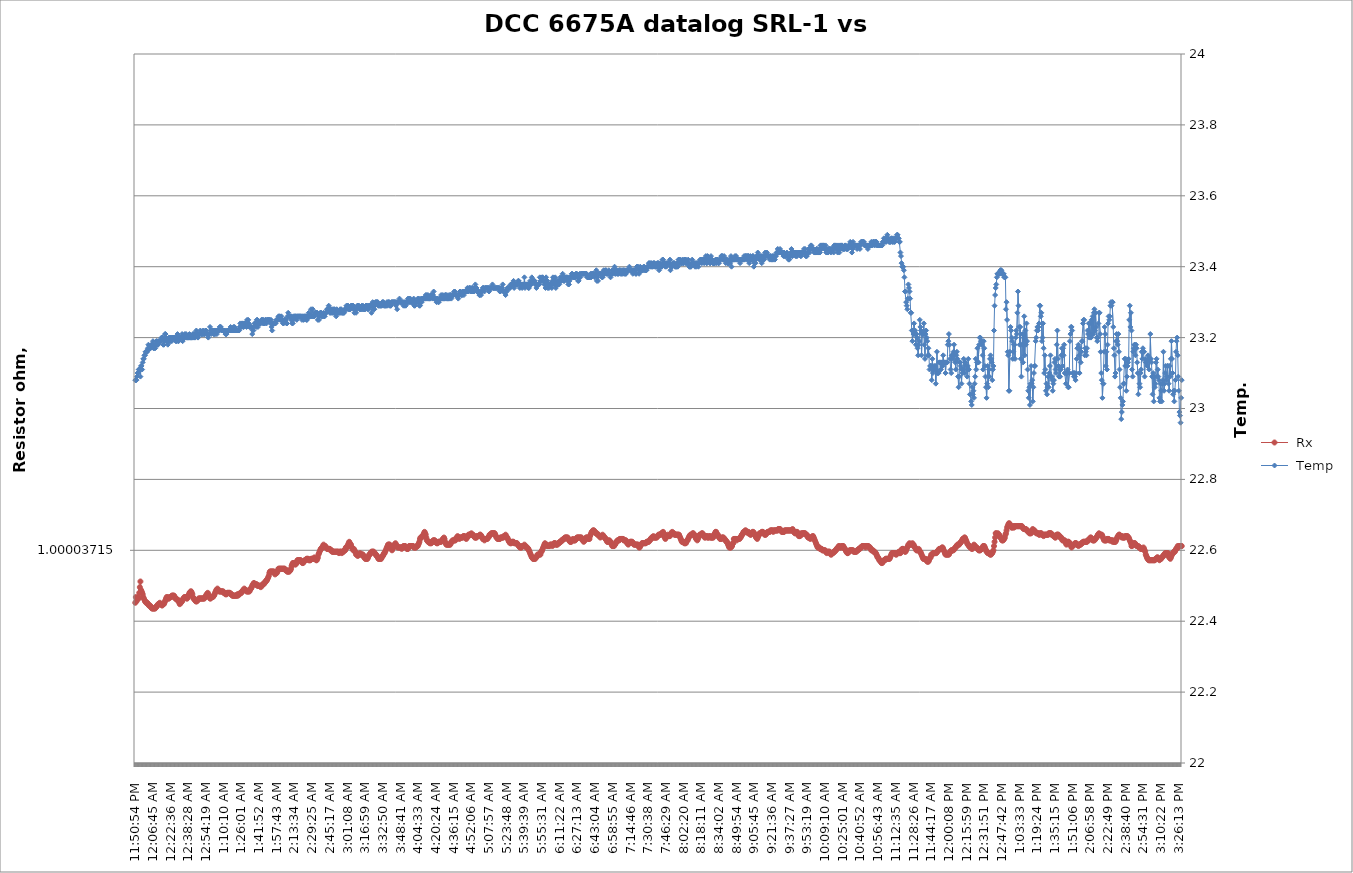
| Category |  Rx |
|---|---|
| 2021-03-05 23:50:54 | 1 |
| 2021-03-05 23:51:25 | 1 |
| 2021-03-05 23:51:55 | 1 |
| 2021-03-05 23:52:26 | 1 |
| 2021-03-05 23:52:57 | 1 |
| 2021-03-05 23:53:28 | 1 |
| 2021-03-05 23:53:58 | 1 |
| 2021-03-05 23:54:29 | 1 |
| 2021-03-05 23:55:00 | 1 |
| 2021-03-05 23:55:30 | 1 |
| 2021-03-05 23:56:01 | 1 |
| 2021-03-05 23:56:32 | 1 |
| 2021-03-05 23:57:02 | 1 |
| 2021-03-05 23:57:33 | 1 |
| 2021-03-05 23:58:04 | 1 |
| 2021-03-05 23:58:34 | 1 |
| 2021-03-05 23:59:05 | 1 |
| 2021-03-05 23:59:36 | 1 |
| 2021-03-06 00:00:06 | 1 |
| 2021-03-06 00:00:37 | 1 |
| 2021-03-06 00:01:08 | 1 |
| 2021-03-06 00:01:38 | 1 |
| 2021-03-06 00:02:09 | 1 |
| 2021-03-06 00:02:40 | 1 |
| 2021-03-06 00:03:10 | 1 |
| 2021-03-06 00:03:41 | 1 |
| 2021-03-06 00:04:12 | 1 |
| 2021-03-06 00:04:43 | 1 |
| 2021-03-06 00:05:13 | 1 |
| 2021-03-06 00:05:44 | 1 |
| 2021-03-06 00:06:15 | 1 |
| 2021-03-06 00:06:45 | 1 |
| 2021-03-06 00:07:16 | 1 |
| 2021-03-06 00:07:47 | 1 |
| 2021-03-06 00:08:17 | 1 |
| 2021-03-06 00:08:48 | 1 |
| 2021-03-06 00:09:19 | 1 |
| 2021-03-06 00:09:49 | 1 |
| 2021-03-06 00:10:20 | 1 |
| 2021-03-06 00:10:51 | 1 |
| 2021-03-06 00:11:21 | 1 |
| 2021-03-06 00:11:52 | 1 |
| 2021-03-06 00:12:23 | 1 |
| 2021-03-06 00:12:53 | 1 |
| 2021-03-06 00:13:24 | 1 |
| 2021-03-06 00:13:55 | 1 |
| 2021-03-06 00:14:25 | 1 |
| 2021-03-06 00:14:56 | 1 |
| 2021-03-06 00:15:27 | 1 |
| 2021-03-06 00:15:58 | 1 |
| 2021-03-06 00:16:28 | 1 |
| 2021-03-06 00:16:59 | 1 |
| 2021-03-06 00:17:30 | 1 |
| 2021-03-06 00:18:00 | 1 |
| 2021-03-06 00:18:31 | 1 |
| 2021-03-06 00:19:02 | 1 |
| 2021-03-06 00:19:32 | 1 |
| 2021-03-06 00:20:03 | 1 |
| 2021-03-06 00:20:34 | 1 |
| 2021-03-06 00:21:04 | 1 |
| 2021-03-06 00:21:35 | 1 |
| 2021-03-06 00:22:06 | 1 |
| 2021-03-06 00:22:36 | 1 |
| 2021-03-06 00:23:07 | 1 |
| 2021-03-06 00:23:38 | 1 |
| 2021-03-06 00:24:08 | 1 |
| 2021-03-06 00:24:39 | 1 |
| 2021-03-06 00:25:10 | 1 |
| 2021-03-06 00:25:40 | 1 |
| 2021-03-06 00:26:11 | 1 |
| 2021-03-06 00:26:42 | 1 |
| 2021-03-06 00:27:12 | 1 |
| 2021-03-06 00:27:43 | 1 |
| 2021-03-06 00:28:14 | 1 |
| 2021-03-06 00:28:45 | 1 |
| 2021-03-06 00:29:15 | 1 |
| 2021-03-06 00:29:46 | 1 |
| 2021-03-06 00:30:17 | 1 |
| 2021-03-06 00:30:47 | 1 |
| 2021-03-06 00:31:18 | 1 |
| 2021-03-06 00:31:49 | 1 |
| 2021-03-06 00:32:19 | 1 |
| 2021-03-06 00:32:50 | 1 |
| 2021-03-06 00:33:21 | 1 |
| 2021-03-06 00:33:51 | 1 |
| 2021-03-06 00:34:22 | 1 |
| 2021-03-06 00:34:53 | 1 |
| 2021-03-06 00:35:23 | 1 |
| 2021-03-06 00:35:54 | 1 |
| 2021-03-06 00:36:25 | 1 |
| 2021-03-06 00:36:55 | 1 |
| 2021-03-06 00:37:26 | 1 |
| 2021-03-06 00:37:57 | 1 |
| 2021-03-06 00:38:28 | 1 |
| 2021-03-06 00:38:58 | 1 |
| 2021-03-06 00:39:29 | 1 |
| 2021-03-06 00:40:00 | 1 |
| 2021-03-06 00:40:30 | 1 |
| 2021-03-06 00:41:01 | 1 |
| 2021-03-06 00:41:32 | 1 |
| 2021-03-06 00:42:02 | 1 |
| 2021-03-06 00:42:33 | 1 |
| 2021-03-06 00:43:04 | 1 |
| 2021-03-06 00:43:34 | 1 |
| 2021-03-06 00:44:05 | 1 |
| 2021-03-06 00:44:36 | 1 |
| 2021-03-06 00:45:06 | 1 |
| 2021-03-06 00:45:37 | 1 |
| 2021-03-06 00:46:08 | 1 |
| 2021-03-06 00:46:38 | 1 |
| 2021-03-06 00:47:09 | 1 |
| 2021-03-06 00:47:40 | 1 |
| 2021-03-06 00:48:10 | 1 |
| 2021-03-06 00:48:41 | 1 |
| 2021-03-06 00:49:12 | 1 |
| 2021-03-06 00:49:42 | 1 |
| 2021-03-06 00:50:13 | 1 |
| 2021-03-06 00:50:44 | 1 |
| 2021-03-06 00:51:15 | 1 |
| 2021-03-06 00:51:45 | 1 |
| 2021-03-06 00:52:16 | 1 |
| 2021-03-06 00:52:47 | 1 |
| 2021-03-06 00:53:17 | 1 |
| 2021-03-06 00:53:48 | 1 |
| 2021-03-06 00:54:19 | 1 |
| 2021-03-06 00:54:49 | 1 |
| 2021-03-06 00:55:20 | 1 |
| 2021-03-06 00:55:51 | 1 |
| 2021-03-06 00:56:21 | 1 |
| 2021-03-06 00:56:52 | 1 |
| 2021-03-06 00:57:23 | 1 |
| 2021-03-06 00:57:53 | 1 |
| 2021-03-06 00:58:24 | 1 |
| 2021-03-06 00:58:55 | 1 |
| 2021-03-06 00:59:25 | 1 |
| 2021-03-06 00:59:56 | 1 |
| 2021-03-06 01:00:27 | 1 |
| 2021-03-06 01:00:57 | 1 |
| 2021-03-06 01:01:28 | 1 |
| 2021-03-06 01:01:59 | 1 |
| 2021-03-06 01:02:30 | 1 |
| 2021-03-06 01:03:00 | 1 |
| 2021-03-06 01:03:31 | 1 |
| 2021-03-06 01:04:02 | 1 |
| 2021-03-06 01:04:32 | 1 |
| 2021-03-06 01:05:03 | 1 |
| 2021-03-06 01:05:34 | 1 |
| 2021-03-06 01:06:04 | 1 |
| 2021-03-06 01:06:35 | 1 |
| 2021-03-06 01:07:06 | 1 |
| 2021-03-06 01:07:36 | 1 |
| 2021-03-06 01:08:07 | 1 |
| 2021-03-06 01:08:38 | 1 |
| 2021-03-06 01:09:08 | 1 |
| 2021-03-06 01:09:39 | 1 |
| 2021-03-06 01:10:10 | 1 |
| 2021-03-06 01:10:40 | 1 |
| 2021-03-06 01:11:11 | 1 |
| 2021-03-06 01:11:42 | 1 |
| 2021-03-06 01:12:12 | 1 |
| 2021-03-06 01:12:43 | 1 |
| 2021-03-06 01:13:14 | 1 |
| 2021-03-06 01:13:44 | 1 |
| 2021-03-06 01:14:15 | 1 |
| 2021-03-06 01:14:46 | 1 |
| 2021-03-06 01:15:17 | 1 |
| 2021-03-06 01:15:47 | 1 |
| 2021-03-06 01:16:18 | 1 |
| 2021-03-06 01:16:49 | 1 |
| 2021-03-06 01:17:19 | 1 |
| 2021-03-06 01:17:50 | 1 |
| 2021-03-06 01:18:21 | 1 |
| 2021-03-06 01:18:51 | 1 |
| 2021-03-06 01:19:22 | 1 |
| 2021-03-06 01:19:53 | 1 |
| 2021-03-06 01:20:23 | 1 |
| 2021-03-06 01:20:54 | 1 |
| 2021-03-06 01:21:25 | 1 |
| 2021-03-06 01:21:55 | 1 |
| 2021-03-06 01:22:26 | 1 |
| 2021-03-06 01:22:57 | 1 |
| 2021-03-06 01:23:27 | 1 |
| 2021-03-06 01:23:58 | 1 |
| 2021-03-06 01:24:29 | 1 |
| 2021-03-06 01:24:59 | 1 |
| 2021-03-06 01:25:30 | 1 |
| 2021-03-06 01:26:01 | 1 |
| 2021-03-06 01:26:31 | 1 |
| 2021-03-06 01:27:02 | 1 |
| 2021-03-06 01:27:33 | 1 |
| 2021-03-06 01:28:04 | 1 |
| 2021-03-06 01:28:34 | 1 |
| 2021-03-06 01:29:05 | 1 |
| 2021-03-06 01:29:36 | 1 |
| 2021-03-06 01:30:06 | 1 |
| 2021-03-06 01:30:37 | 1 |
| 2021-03-06 01:31:08 | 1 |
| 2021-03-06 01:31:38 | 1 |
| 2021-03-06 01:32:09 | 1 |
| 2021-03-06 01:32:40 | 1 |
| 2021-03-06 01:33:10 | 1 |
| 2021-03-06 01:33:41 | 1 |
| 2021-03-06 01:34:12 | 1 |
| 2021-03-06 01:34:42 | 1 |
| 2021-03-06 01:35:13 | 1 |
| 2021-03-06 01:35:44 | 1 |
| 2021-03-06 01:36:14 | 1 |
| 2021-03-06 01:36:45 | 1 |
| 2021-03-06 01:37:16 | 1 |
| 2021-03-06 01:37:46 | 1 |
| 2021-03-06 01:38:17 | 1 |
| 2021-03-06 01:38:48 | 1 |
| 2021-03-06 01:39:19 | 1 |
| 2021-03-06 01:39:49 | 1 |
| 2021-03-06 01:40:20 | 1 |
| 2021-03-06 01:40:51 | 1 |
| 2021-03-06 01:41:21 | 1 |
| 2021-03-06 01:41:52 | 1 |
| 2021-03-06 01:42:23 | 1 |
| 2021-03-06 01:42:53 | 1 |
| 2021-03-06 01:43:24 | 1 |
| 2021-03-06 01:43:55 | 1 |
| 2021-03-06 01:44:25 | 1 |
| 2021-03-06 01:44:56 | 1 |
| 2021-03-06 01:45:27 | 1 |
| 2021-03-06 01:45:57 | 1 |
| 2021-03-06 01:46:28 | 1 |
| 2021-03-06 01:46:59 | 1 |
| 2021-03-06 01:47:29 | 1 |
| 2021-03-06 01:48:00 | 1 |
| 2021-03-06 01:48:31 | 1 |
| 2021-03-06 01:49:01 | 1 |
| 2021-03-06 01:49:32 | 1 |
| 2021-03-06 01:50:03 | 1 |
| 2021-03-06 01:50:34 | 1 |
| 2021-03-06 01:51:04 | 1 |
| 2021-03-06 01:51:35 | 1 |
| 2021-03-06 01:52:06 | 1 |
| 2021-03-06 01:52:36 | 1 |
| 2021-03-06 01:53:07 | 1 |
| 2021-03-06 01:53:38 | 1 |
| 2021-03-06 01:54:08 | 1 |
| 2021-03-06 01:54:39 | 1 |
| 2021-03-06 01:55:10 | 1 |
| 2021-03-06 01:55:40 | 1 |
| 2021-03-06 01:56:11 | 1 |
| 2021-03-06 01:56:42 | 1 |
| 2021-03-06 01:57:12 | 1 |
| 2021-03-06 01:57:43 | 1 |
| 2021-03-06 01:58:14 | 1 |
| 2021-03-06 01:58:44 | 1 |
| 2021-03-06 01:59:15 | 1 |
| 2021-03-06 01:59:46 | 1 |
| 2021-03-06 02:00:17 | 1 |
| 2021-03-06 02:00:47 | 1 |
| 2021-03-06 02:01:18 | 1 |
| 2021-03-06 02:01:49 | 1 |
| 2021-03-06 02:02:19 | 1 |
| 2021-03-06 02:02:50 | 1 |
| 2021-03-06 02:03:21 | 1 |
| 2021-03-06 02:03:51 | 1 |
| 2021-03-06 02:04:22 | 1 |
| 2021-03-06 02:04:53 | 1 |
| 2021-03-06 02:05:23 | 1 |
| 2021-03-06 02:05:54 | 1 |
| 2021-03-06 02:06:25 | 1 |
| 2021-03-06 02:06:55 | 1 |
| 2021-03-06 02:07:26 | 1 |
| 2021-03-06 02:07:57 | 1 |
| 2021-03-06 02:08:27 | 1 |
| 2021-03-06 02:08:58 | 1 |
| 2021-03-06 02:09:29 | 1 |
| 2021-03-06 02:10:00 | 1 |
| 2021-03-06 02:10:30 | 1 |
| 2021-03-06 02:11:01 | 1 |
| 2021-03-06 02:11:32 | 1 |
| 2021-03-06 02:12:02 | 1 |
| 2021-03-06 02:12:33 | 1 |
| 2021-03-06 02:13:04 | 1 |
| 2021-03-06 02:13:34 | 1 |
| 2021-03-06 02:14:05 | 1 |
| 2021-03-06 02:14:36 | 1 |
| 2021-03-06 02:15:06 | 1 |
| 2021-03-06 02:15:37 | 1 |
| 2021-03-06 02:16:08 | 1 |
| 2021-03-06 02:16:38 | 1 |
| 2021-03-06 02:17:09 | 1 |
| 2021-03-06 02:17:40 | 1 |
| 2021-03-06 02:18:10 | 1 |
| 2021-03-06 02:18:41 | 1 |
| 2021-03-06 02:19:12 | 1 |
| 2021-03-06 02:19:42 | 1 |
| 2021-03-06 02:20:13 | 1 |
| 2021-03-06 02:20:44 | 1 |
| 2021-03-06 02:21:15 | 1 |
| 2021-03-06 02:21:45 | 1 |
| 2021-03-06 02:22:16 | 1 |
| 2021-03-06 02:22:47 | 1 |
| 2021-03-06 02:23:17 | 1 |
| 2021-03-06 02:23:48 | 1 |
| 2021-03-06 02:24:19 | 1 |
| 2021-03-06 02:24:49 | 1 |
| 2021-03-06 02:25:20 | 1 |
| 2021-03-06 02:25:51 | 1 |
| 2021-03-06 02:26:21 | 1 |
| 2021-03-06 02:26:52 | 1 |
| 2021-03-06 02:27:23 | 1 |
| 2021-03-06 02:27:53 | 1 |
| 2021-03-06 02:28:24 | 1 |
| 2021-03-06 02:28:55 | 1 |
| 2021-03-06 02:29:25 | 1 |
| 2021-03-06 02:29:56 | 1 |
| 2021-03-06 02:30:27 | 1 |
| 2021-03-06 02:30:58 | 1 |
| 2021-03-06 02:31:28 | 1 |
| 2021-03-06 02:31:59 | 1 |
| 2021-03-06 02:32:30 | 1 |
| 2021-03-06 02:33:00 | 1 |
| 2021-03-06 02:33:31 | 1 |
| 2021-03-06 02:34:02 | 1 |
| 2021-03-06 02:34:32 | 1 |
| 2021-03-06 02:35:03 | 1 |
| 2021-03-06 02:35:34 | 1 |
| 2021-03-06 02:36:04 | 1 |
| 2021-03-06 02:36:35 | 1 |
| 2021-03-06 02:37:06 | 1 |
| 2021-03-06 02:37:36 | 1 |
| 2021-03-06 02:38:07 | 1 |
| 2021-03-06 02:38:38 | 1 |
| 2021-03-06 02:39:08 | 1 |
| 2021-03-06 02:39:39 | 1 |
| 2021-03-06 02:40:10 | 1 |
| 2021-03-06 02:40:41 | 1 |
| 2021-03-06 02:41:11 | 1 |
| 2021-03-06 02:41:42 | 1 |
| 2021-03-06 02:42:13 | 1 |
| 2021-03-06 02:42:43 | 1 |
| 2021-03-06 02:43:14 | 1 |
| 2021-03-06 02:43:45 | 1 |
| 2021-03-06 02:44:15 | 1 |
| 2021-03-06 02:44:46 | 1 |
| 2021-03-06 02:45:17 | 1 |
| 2021-03-06 02:45:47 | 1 |
| 2021-03-06 02:46:18 | 1 |
| 2021-03-06 02:46:49 | 1 |
| 2021-03-06 02:47:19 | 1 |
| 2021-03-06 02:47:50 | 1 |
| 2021-03-06 02:48:21 | 1 |
| 2021-03-06 02:48:51 | 1 |
| 2021-03-06 02:49:22 | 1 |
| 2021-03-06 02:49:53 | 1 |
| 2021-03-06 02:50:24 | 1 |
| 2021-03-06 02:50:54 | 1 |
| 2021-03-06 02:51:25 | 1 |
| 2021-03-06 02:51:56 | 1 |
| 2021-03-06 02:52:26 | 1 |
| 2021-03-06 02:52:57 | 1 |
| 2021-03-06 02:53:28 | 1 |
| 2021-03-06 02:53:58 | 1 |
| 2021-03-06 02:54:29 | 1 |
| 2021-03-06 02:55:00 | 1 |
| 2021-03-06 02:55:30 | 1 |
| 2021-03-06 02:56:01 | 1 |
| 2021-03-06 02:56:32 | 1 |
| 2021-03-06 02:57:02 | 1 |
| 2021-03-06 02:57:33 | 1 |
| 2021-03-06 02:58:04 | 1 |
| 2021-03-06 02:58:35 | 1 |
| 2021-03-06 02:59:05 | 1 |
| 2021-03-06 02:59:36 | 1 |
| 2021-03-06 03:00:07 | 1 |
| 2021-03-06 03:00:37 | 1 |
| 2021-03-06 03:01:08 | 1 |
| 2021-03-06 03:01:39 | 1 |
| 2021-03-06 03:02:09 | 1 |
| 2021-03-06 03:02:40 | 1 |
| 2021-03-06 03:03:11 | 1 |
| 2021-03-06 03:03:41 | 1 |
| 2021-03-06 03:04:12 | 1 |
| 2021-03-06 03:04:43 | 1 |
| 2021-03-06 03:05:13 | 1 |
| 2021-03-06 03:05:44 | 1 |
| 2021-03-06 03:06:15 | 1 |
| 2021-03-06 03:06:45 | 1 |
| 2021-03-06 03:07:16 | 1 |
| 2021-03-06 03:07:47 | 1 |
| 2021-03-06 03:08:18 | 1 |
| 2021-03-06 03:08:48 | 1 |
| 2021-03-06 03:09:19 | 1 |
| 2021-03-06 03:09:50 | 1 |
| 2021-03-06 03:10:20 | 1 |
| 2021-03-06 03:10:51 | 1 |
| 2021-03-06 03:11:22 | 1 |
| 2021-03-06 03:11:52 | 1 |
| 2021-03-06 03:12:23 | 1 |
| 2021-03-06 03:12:54 | 1 |
| 2021-03-06 03:13:24 | 1 |
| 2021-03-06 03:13:55 | 1 |
| 2021-03-06 03:14:26 | 1 |
| 2021-03-06 03:14:56 | 1 |
| 2021-03-06 03:15:27 | 1 |
| 2021-03-06 03:15:58 | 1 |
| 2021-03-06 03:16:28 | 1 |
| 2021-03-06 03:16:59 | 1 |
| 2021-03-06 03:17:30 | 1 |
| 2021-03-06 03:18:01 | 1 |
| 2021-03-06 03:18:31 | 1 |
| 2021-03-06 03:19:02 | 1 |
| 2021-03-06 03:19:33 | 1 |
| 2021-03-06 03:20:03 | 1 |
| 2021-03-06 03:20:34 | 1 |
| 2021-03-06 03:21:05 | 1 |
| 2021-03-06 03:21:35 | 1 |
| 2021-03-06 03:22:06 | 1 |
| 2021-03-06 03:22:37 | 1 |
| 2021-03-06 03:23:07 | 1 |
| 2021-03-06 03:23:38 | 1 |
| 2021-03-06 03:24:09 | 1 |
| 2021-03-06 03:24:39 | 1 |
| 2021-03-06 03:25:10 | 1 |
| 2021-03-06 03:25:41 | 1 |
| 2021-03-06 03:26:11 | 1 |
| 2021-03-06 03:26:42 | 1 |
| 2021-03-06 03:27:13 | 1 |
| 2021-03-06 03:27:44 | 1 |
| 2021-03-06 03:28:14 | 1 |
| 2021-03-06 03:28:45 | 1 |
| 2021-03-06 03:29:16 | 1 |
| 2021-03-06 03:29:46 | 1 |
| 2021-03-06 03:30:17 | 1 |
| 2021-03-06 03:30:48 | 1 |
| 2021-03-06 03:31:18 | 1 |
| 2021-03-06 03:31:49 | 1 |
| 2021-03-06 03:32:20 | 1 |
| 2021-03-06 03:32:50 | 1 |
| 2021-03-06 03:33:21 | 1 |
| 2021-03-06 03:33:52 | 1 |
| 2021-03-06 03:34:22 | 1 |
| 2021-03-06 03:34:53 | 1 |
| 2021-03-06 03:35:24 | 1 |
| 2021-03-06 03:35:54 | 1 |
| 2021-03-06 03:36:25 | 1 |
| 2021-03-06 03:36:56 | 1 |
| 2021-03-06 03:37:26 | 1 |
| 2021-03-06 03:37:57 | 1 |
| 2021-03-06 03:38:28 | 1 |
| 2021-03-06 03:38:59 | 1 |
| 2021-03-06 03:39:29 | 1 |
| 2021-03-06 03:40:00 | 1 |
| 2021-03-06 03:40:31 | 1 |
| 2021-03-06 03:41:01 | 1 |
| 2021-03-06 03:41:32 | 1 |
| 2021-03-06 03:42:03 | 1 |
| 2021-03-06 03:42:33 | 1 |
| 2021-03-06 03:43:04 | 1 |
| 2021-03-06 03:43:35 | 1 |
| 2021-03-06 03:44:05 | 1 |
| 2021-03-06 03:44:36 | 1 |
| 2021-03-06 03:45:07 | 1 |
| 2021-03-06 03:45:37 | 1 |
| 2021-03-06 03:46:08 | 1 |
| 2021-03-06 03:46:39 | 1 |
| 2021-03-06 03:47:09 | 1 |
| 2021-03-06 03:47:40 | 1 |
| 2021-03-06 03:48:11 | 1 |
| 2021-03-06 03:48:41 | 1 |
| 2021-03-06 03:49:12 | 1 |
| 2021-03-06 03:49:43 | 1 |
| 2021-03-06 03:50:14 | 1 |
| 2021-03-06 03:50:44 | 1 |
| 2021-03-06 03:51:15 | 1 |
| 2021-03-06 03:51:46 | 1 |
| 2021-03-06 03:52:16 | 1 |
| 2021-03-06 03:52:47 | 1 |
| 2021-03-06 03:53:18 | 1 |
| 2021-03-06 03:53:48 | 1 |
| 2021-03-06 03:54:19 | 1 |
| 2021-03-06 03:54:50 | 1 |
| 2021-03-06 03:55:20 | 1 |
| 2021-03-06 03:55:51 | 1 |
| 2021-03-06 03:56:22 | 1 |
| 2021-03-06 03:56:52 | 1 |
| 2021-03-06 03:57:23 | 1 |
| 2021-03-06 03:57:54 | 1 |
| 2021-03-06 03:58:24 | 1 |
| 2021-03-06 03:58:55 | 1 |
| 2021-03-06 03:59:26 | 1 |
| 2021-03-06 03:59:56 | 1 |
| 2021-03-06 04:00:27 | 1 |
| 2021-03-06 04:00:58 | 1 |
| 2021-03-06 04:01:29 | 1 |
| 2021-03-06 04:01:59 | 1 |
| 2021-03-06 04:02:30 | 1 |
| 2021-03-06 04:03:01 | 1 |
| 2021-03-06 04:03:31 | 1 |
| 2021-03-06 04:04:02 | 1 |
| 2021-03-06 04:04:33 | 1 |
| 2021-03-06 04:05:03 | 1 |
| 2021-03-06 04:05:34 | 1 |
| 2021-03-06 04:06:05 | 1 |
| 2021-03-06 04:06:35 | 1 |
| 2021-03-06 04:07:06 | 1 |
| 2021-03-06 04:07:37 | 1 |
| 2021-03-06 04:08:07 | 1 |
| 2021-03-06 04:08:38 | 1 |
| 2021-03-06 04:09:09 | 1 |
| 2021-03-06 04:09:39 | 1 |
| 2021-03-06 04:10:10 | 1 |
| 2021-03-06 04:10:41 | 1 |
| 2021-03-06 04:11:12 | 1 |
| 2021-03-06 04:11:42 | 1 |
| 2021-03-06 04:12:13 | 1 |
| 2021-03-06 04:12:44 | 1 |
| 2021-03-06 04:13:14 | 1 |
| 2021-03-06 04:13:45 | 1 |
| 2021-03-06 04:14:16 | 1 |
| 2021-03-06 04:14:46 | 1 |
| 2021-03-06 04:15:17 | 1 |
| 2021-03-06 04:15:48 | 1 |
| 2021-03-06 04:16:18 | 1 |
| 2021-03-06 04:16:49 | 1 |
| 2021-03-06 04:17:20 | 1 |
| 2021-03-06 04:17:50 | 1 |
| 2021-03-06 04:18:21 | 1 |
| 2021-03-06 04:18:52 | 1 |
| 2021-03-06 04:19:22 | 1 |
| 2021-03-06 04:19:53 | 1 |
| 2021-03-06 04:20:24 | 1 |
| 2021-03-06 04:20:54 | 1 |
| 2021-03-06 04:21:25 | 1 |
| 2021-03-06 04:21:56 | 1 |
| 2021-03-06 04:22:27 | 1 |
| 2021-03-06 04:22:57 | 1 |
| 2021-03-06 04:23:28 | 1 |
| 2021-03-06 04:23:59 | 1 |
| 2021-03-06 04:24:29 | 1 |
| 2021-03-06 04:25:00 | 1 |
| 2021-03-06 04:25:31 | 1 |
| 2021-03-06 04:26:01 | 1 |
| 2021-03-06 04:26:32 | 1 |
| 2021-03-06 04:27:03 | 1 |
| 2021-03-06 04:27:33 | 1 |
| 2021-03-06 04:28:04 | 1 |
| 2021-03-06 04:28:35 | 1 |
| 2021-03-06 04:29:05 | 1 |
| 2021-03-06 04:29:36 | 1 |
| 2021-03-06 04:30:07 | 1 |
| 2021-03-06 04:30:37 | 1 |
| 2021-03-06 04:31:08 | 1 |
| 2021-03-06 04:31:39 | 1 |
| 2021-03-06 04:32:09 | 1 |
| 2021-03-06 04:32:40 | 1 |
| 2021-03-06 04:33:11 | 1 |
| 2021-03-06 04:33:42 | 1 |
| 2021-03-06 04:34:12 | 1 |
| 2021-03-06 04:34:43 | 1 |
| 2021-03-06 04:35:14 | 1 |
| 2021-03-06 04:35:44 | 1 |
| 2021-03-06 04:36:15 | 1 |
| 2021-03-06 04:36:46 | 1 |
| 2021-03-06 04:37:16 | 1 |
| 2021-03-06 04:37:47 | 1 |
| 2021-03-06 04:38:18 | 1 |
| 2021-03-06 04:38:48 | 1 |
| 2021-03-06 04:39:19 | 1 |
| 2021-03-06 04:39:50 | 1 |
| 2021-03-06 04:40:20 | 1 |
| 2021-03-06 04:40:51 | 1 |
| 2021-03-06 04:41:22 | 1 |
| 2021-03-06 04:41:52 | 1 |
| 2021-03-06 04:42:23 | 1 |
| 2021-03-06 04:42:54 | 1 |
| 2021-03-06 04:43:24 | 1 |
| 2021-03-06 04:43:55 | 1 |
| 2021-03-06 04:44:26 | 1 |
| 2021-03-06 04:44:57 | 1 |
| 2021-03-06 04:45:27 | 1 |
| 2021-03-06 04:45:58 | 1 |
| 2021-03-06 04:46:29 | 1 |
| 2021-03-06 04:46:59 | 1 |
| 2021-03-06 04:47:30 | 1 |
| 2021-03-06 04:48:01 | 1 |
| 2021-03-06 04:48:31 | 1 |
| 2021-03-06 04:49:02 | 1 |
| 2021-03-06 04:49:33 | 1 |
| 2021-03-06 04:50:03 | 1 |
| 2021-03-06 04:50:34 | 1 |
| 2021-03-06 04:51:05 | 1 |
| 2021-03-06 04:51:35 | 1 |
| 2021-03-06 04:52:06 | 1 |
| 2021-03-06 04:52:37 | 1 |
| 2021-03-06 04:53:07 | 1 |
| 2021-03-06 04:53:38 | 1 |
| 2021-03-06 04:54:09 | 1 |
| 2021-03-06 04:54:39 | 1 |
| 2021-03-06 04:55:10 | 1 |
| 2021-03-06 04:55:41 | 1 |
| 2021-03-06 04:56:12 | 1 |
| 2021-03-06 04:56:42 | 1 |
| 2021-03-06 04:57:13 | 1 |
| 2021-03-06 04:57:44 | 1 |
| 2021-03-06 04:58:14 | 1 |
| 2021-03-06 04:58:45 | 1 |
| 2021-03-06 04:59:16 | 1 |
| 2021-03-06 04:59:46 | 1 |
| 2021-03-06 05:00:17 | 1 |
| 2021-03-06 05:00:48 | 1 |
| 2021-03-06 05:01:18 | 1 |
| 2021-03-06 05:01:49 | 1 |
| 2021-03-06 05:02:20 | 1 |
| 2021-03-06 05:02:50 | 1 |
| 2021-03-06 05:03:21 | 1 |
| 2021-03-06 05:03:52 | 1 |
| 2021-03-06 05:04:22 | 1 |
| 2021-03-06 05:04:53 | 1 |
| 2021-03-06 05:05:24 | 1 |
| 2021-03-06 05:05:54 | 1 |
| 2021-03-06 05:06:25 | 1 |
| 2021-03-06 05:06:56 | 1 |
| 2021-03-06 05:07:27 | 1 |
| 2021-03-06 05:07:57 | 1 |
| 2021-03-06 05:08:28 | 1 |
| 2021-03-06 05:08:59 | 1 |
| 2021-03-06 05:09:29 | 1 |
| 2021-03-06 05:10:00 | 1 |
| 2021-03-06 05:10:31 | 1 |
| 2021-03-06 05:11:01 | 1 |
| 2021-03-06 05:11:32 | 1 |
| 2021-03-06 05:12:03 | 1 |
| 2021-03-06 05:12:33 | 1 |
| 2021-03-06 05:13:04 | 1 |
| 2021-03-06 05:13:35 | 1 |
| 2021-03-06 05:14:05 | 1 |
| 2021-03-06 05:14:36 | 1 |
| 2021-03-06 05:15:07 | 1 |
| 2021-03-06 05:15:37 | 1 |
| 2021-03-06 05:16:08 | 1 |
| 2021-03-06 05:16:39 | 1 |
| 2021-03-06 05:17:09 | 1 |
| 2021-03-06 05:17:40 | 1 |
| 2021-03-06 05:18:11 | 1 |
| 2021-03-06 05:18:42 | 1 |
| 2021-03-06 05:19:12 | 1 |
| 2021-03-06 05:19:43 | 1 |
| 2021-03-06 05:20:14 | 1 |
| 2021-03-06 05:20:44 | 1 |
| 2021-03-06 05:21:15 | 1 |
| 2021-03-06 05:21:46 | 1 |
| 2021-03-06 05:22:16 | 1 |
| 2021-03-06 05:22:47 | 1 |
| 2021-03-06 05:23:18 | 1 |
| 2021-03-06 05:23:48 | 1 |
| 2021-03-06 05:24:19 | 1 |
| 2021-03-06 05:24:50 | 1 |
| 2021-03-06 05:25:20 | 1 |
| 2021-03-06 05:25:51 | 1 |
| 2021-03-06 05:26:22 | 1 |
| 2021-03-06 05:26:52 | 1 |
| 2021-03-06 05:27:23 | 1 |
| 2021-03-06 05:27:54 | 1 |
| 2021-03-06 05:28:24 | 1 |
| 2021-03-06 05:28:55 | 1 |
| 2021-03-06 05:29:26 | 1 |
| 2021-03-06 05:29:57 | 1 |
| 2021-03-06 05:30:27 | 1 |
| 2021-03-06 05:30:58 | 1 |
| 2021-03-06 05:31:29 | 1 |
| 2021-03-06 05:31:59 | 1 |
| 2021-03-06 05:32:30 | 1 |
| 2021-03-06 05:33:01 | 1 |
| 2021-03-06 05:33:31 | 1 |
| 2021-03-06 05:34:02 | 1 |
| 2021-03-06 05:34:33 | 1 |
| 2021-03-06 05:35:03 | 1 |
| 2021-03-06 05:35:34 | 1 |
| 2021-03-06 05:36:05 | 1 |
| 2021-03-06 05:36:35 | 1 |
| 2021-03-06 05:37:06 | 1 |
| 2021-03-06 05:37:37 | 1 |
| 2021-03-06 05:38:07 | 1 |
| 2021-03-06 05:38:38 | 1 |
| 2021-03-06 05:39:09 | 1 |
| 2021-03-06 05:39:39 | 1 |
| 2021-03-06 05:40:10 | 1 |
| 2021-03-06 05:40:41 | 1 |
| 2021-03-06 05:41:12 | 1 |
| 2021-03-06 05:41:42 | 1 |
| 2021-03-06 05:42:13 | 1 |
| 2021-03-06 05:42:44 | 1 |
| 2021-03-06 05:43:14 | 1 |
| 2021-03-06 05:43:45 | 1 |
| 2021-03-06 05:44:16 | 1 |
| 2021-03-06 05:44:46 | 1 |
| 2021-03-06 05:45:17 | 1 |
| 2021-03-06 05:45:48 | 1 |
| 2021-03-06 05:46:18 | 1 |
| 2021-03-06 05:46:49 | 1 |
| 2021-03-06 05:47:20 | 1 |
| 2021-03-06 05:47:50 | 1 |
| 2021-03-06 05:48:21 | 1 |
| 2021-03-06 05:48:52 | 1 |
| 2021-03-06 05:49:22 | 1 |
| 2021-03-06 05:49:53 | 1 |
| 2021-03-06 05:50:24 | 1 |
| 2021-03-06 05:50:55 | 1 |
| 2021-03-06 05:51:25 | 1 |
| 2021-03-06 05:51:56 | 1 |
| 2021-03-06 05:52:27 | 1 |
| 2021-03-06 05:52:57 | 1 |
| 2021-03-06 05:53:28 | 1 |
| 2021-03-06 05:53:59 | 1 |
| 2021-03-06 05:54:29 | 1 |
| 2021-03-06 05:55:00 | 1 |
| 2021-03-06 05:55:31 | 1 |
| 2021-03-06 05:56:01 | 1 |
| 2021-03-06 05:56:32 | 1 |
| 2021-03-06 05:57:03 | 1 |
| 2021-03-06 05:57:33 | 1 |
| 2021-03-06 05:58:04 | 1 |
| 2021-03-06 05:58:35 | 1 |
| 2021-03-06 05:59:05 | 1 |
| 2021-03-06 05:59:36 | 1 |
| 2021-03-06 06:00:07 | 1 |
| 2021-03-06 06:00:37 | 1 |
| 2021-03-06 06:01:08 | 1 |
| 2021-03-06 06:01:39 | 1 |
| 2021-03-06 06:02:10 | 1 |
| 2021-03-06 06:02:40 | 1 |
| 2021-03-06 06:03:11 | 1 |
| 2021-03-06 06:03:42 | 1 |
| 2021-03-06 06:04:12 | 1 |
| 2021-03-06 06:04:43 | 1 |
| 2021-03-06 06:05:14 | 1 |
| 2021-03-06 06:05:44 | 1 |
| 2021-03-06 06:06:15 | 1 |
| 2021-03-06 06:06:46 | 1 |
| 2021-03-06 06:07:16 | 1 |
| 2021-03-06 06:07:47 | 1 |
| 2021-03-06 06:08:18 | 1 |
| 2021-03-06 06:08:48 | 1 |
| 2021-03-06 06:09:19 | 1 |
| 2021-03-06 06:09:50 | 1 |
| 2021-03-06 06:10:20 | 1 |
| 2021-03-06 06:10:51 | 1 |
| 2021-03-06 06:11:22 | 1 |
| 2021-03-06 06:11:52 | 1 |
| 2021-03-06 06:12:23 | 1 |
| 2021-03-06 06:12:54 | 1 |
| 2021-03-06 06:13:25 | 1 |
| 2021-03-06 06:13:55 | 1 |
| 2021-03-06 06:14:26 | 1 |
| 2021-03-06 06:14:57 | 1 |
| 2021-03-06 06:15:27 | 1 |
| 2021-03-06 06:15:58 | 1 |
| 2021-03-06 06:16:29 | 1 |
| 2021-03-06 06:16:59 | 1 |
| 2021-03-06 06:17:30 | 1 |
| 2021-03-06 06:18:01 | 1 |
| 2021-03-06 06:18:31 | 1 |
| 2021-03-06 06:19:02 | 1 |
| 2021-03-06 06:19:33 | 1 |
| 2021-03-06 06:20:03 | 1 |
| 2021-03-06 06:20:34 | 1 |
| 2021-03-06 06:21:05 | 1 |
| 2021-03-06 06:21:35 | 1 |
| 2021-03-06 06:22:06 | 1 |
| 2021-03-06 06:22:37 | 1 |
| 2021-03-06 06:23:07 | 1 |
| 2021-03-06 06:23:38 | 1 |
| 2021-03-06 06:24:09 | 1 |
| 2021-03-06 06:24:40 | 1 |
| 2021-03-06 06:25:10 | 1 |
| 2021-03-06 06:25:41 | 1 |
| 2021-03-06 06:26:12 | 1 |
| 2021-03-06 06:26:42 | 1 |
| 2021-03-06 06:27:13 | 1 |
| 2021-03-06 06:27:44 | 1 |
| 2021-03-06 06:28:14 | 1 |
| 2021-03-06 06:28:45 | 1 |
| 2021-03-06 06:29:16 | 1 |
| 2021-03-06 06:29:46 | 1 |
| 2021-03-06 06:30:17 | 1 |
| 2021-03-06 06:30:48 | 1 |
| 2021-03-06 06:31:18 | 1 |
| 2021-03-06 06:31:49 | 1 |
| 2021-03-06 06:32:20 | 1 |
| 2021-03-06 06:32:50 | 1 |
| 2021-03-06 06:33:21 | 1 |
| 2021-03-06 06:33:52 | 1 |
| 2021-03-06 06:34:22 | 1 |
| 2021-03-06 06:34:53 | 1 |
| 2021-03-06 06:35:24 | 1 |
| 2021-03-06 06:35:55 | 1 |
| 2021-03-06 06:36:25 | 1 |
| 2021-03-06 06:36:56 | 1 |
| 2021-03-06 06:37:27 | 1 |
| 2021-03-06 06:37:57 | 1 |
| 2021-03-06 06:38:28 | 1 |
| 2021-03-06 06:38:59 | 1 |
| 2021-03-06 06:39:29 | 1 |
| 2021-03-06 06:40:00 | 1 |
| 2021-03-06 06:40:31 | 1 |
| 2021-03-06 06:41:01 | 1 |
| 2021-03-06 06:41:32 | 1 |
| 2021-03-06 06:42:03 | 1 |
| 2021-03-06 06:42:33 | 1 |
| 2021-03-06 06:43:04 | 1 |
| 2021-03-06 06:43:35 | 1 |
| 2021-03-06 06:44:05 | 1 |
| 2021-03-06 06:44:36 | 1 |
| 2021-03-06 06:45:07 | 1 |
| 2021-03-06 06:45:37 | 1 |
| 2021-03-06 06:46:08 | 1 |
| 2021-03-06 06:46:39 | 1 |
| 2021-03-06 06:47:10 | 1 |
| 2021-03-06 06:47:40 | 1 |
| 2021-03-06 06:48:11 | 1 |
| 2021-03-06 06:48:42 | 1 |
| 2021-03-06 06:49:12 | 1 |
| 2021-03-06 06:49:43 | 1 |
| 2021-03-06 06:50:14 | 1 |
| 2021-03-06 06:50:44 | 1 |
| 2021-03-06 06:51:15 | 1 |
| 2021-03-06 06:51:46 | 1 |
| 2021-03-06 06:52:16 | 1 |
| 2021-03-06 06:52:47 | 1 |
| 2021-03-06 06:53:18 | 1 |
| 2021-03-06 06:53:48 | 1 |
| 2021-03-06 06:54:19 | 1 |
| 2021-03-06 06:54:50 | 1 |
| 2021-03-06 06:55:20 | 1 |
| 2021-03-06 06:55:51 | 1 |
| 2021-03-06 06:56:22 | 1 |
| 2021-03-06 06:56:52 | 1 |
| 2021-03-06 06:57:23 | 1 |
| 2021-03-06 06:57:54 | 1 |
| 2021-03-06 06:58:25 | 1 |
| 2021-03-06 06:58:55 | 1 |
| 2021-03-06 06:59:26 | 1 |
| 2021-03-06 06:59:57 | 1 |
| 2021-03-06 07:00:27 | 1 |
| 2021-03-06 07:00:58 | 1 |
| 2021-03-06 07:01:29 | 1 |
| 2021-03-06 07:01:59 | 1 |
| 2021-03-06 07:02:30 | 1 |
| 2021-03-06 07:03:01 | 1 |
| 2021-03-06 07:03:31 | 1 |
| 2021-03-06 07:04:02 | 1 |
| 2021-03-06 07:04:33 | 1 |
| 2021-03-06 07:05:03 | 1 |
| 2021-03-06 07:05:34 | 1 |
| 2021-03-06 07:06:05 | 1 |
| 2021-03-06 07:06:35 | 1 |
| 2021-03-06 07:07:06 | 1 |
| 2021-03-06 07:07:37 | 1 |
| 2021-03-06 07:08:08 | 1 |
| 2021-03-06 07:08:38 | 1 |
| 2021-03-06 07:09:09 | 1 |
| 2021-03-06 07:09:40 | 1 |
| 2021-03-06 07:10:10 | 1 |
| 2021-03-06 07:10:41 | 1 |
| 2021-03-06 07:11:12 | 1 |
| 2021-03-06 07:11:42 | 1 |
| 2021-03-06 07:12:13 | 1 |
| 2021-03-06 07:12:44 | 1 |
| 2021-03-06 07:13:14 | 1 |
| 2021-03-06 07:13:45 | 1 |
| 2021-03-06 07:14:16 | 1 |
| 2021-03-06 07:14:46 | 1 |
| 2021-03-06 07:15:17 | 1 |
| 2021-03-06 07:15:48 | 1 |
| 2021-03-06 07:16:18 | 1 |
| 2021-03-06 07:16:49 | 1 |
| 2021-03-06 07:17:20 | 1 |
| 2021-03-06 07:17:50 | 1 |
| 2021-03-06 07:18:21 | 1 |
| 2021-03-06 07:18:52 | 1 |
| 2021-03-06 07:19:23 | 1 |
| 2021-03-06 07:19:53 | 1 |
| 2021-03-06 07:20:24 | 1 |
| 2021-03-06 07:20:55 | 1 |
| 2021-03-06 07:21:25 | 1 |
| 2021-03-06 07:21:56 | 1 |
| 2021-03-06 07:22:27 | 1 |
| 2021-03-06 07:22:57 | 1 |
| 2021-03-06 07:23:28 | 1 |
| 2021-03-06 07:23:59 | 1 |
| 2021-03-06 07:24:29 | 1 |
| 2021-03-06 07:25:00 | 1 |
| 2021-03-06 07:25:31 | 1 |
| 2021-03-06 07:26:01 | 1 |
| 2021-03-06 07:26:32 | 1 |
| 2021-03-06 07:27:03 | 1 |
| 2021-03-06 07:27:33 | 1 |
| 2021-03-06 07:28:04 | 1 |
| 2021-03-06 07:28:35 | 1 |
| 2021-03-06 07:29:06 | 1 |
| 2021-03-06 07:29:36 | 1 |
| 2021-03-06 07:30:07 | 1 |
| 2021-03-06 07:30:38 | 1 |
| 2021-03-06 07:31:08 | 1 |
| 2021-03-06 07:31:39 | 1 |
| 2021-03-06 07:32:10 | 1 |
| 2021-03-06 07:32:40 | 1 |
| 2021-03-06 07:33:11 | 1 |
| 2021-03-06 07:33:42 | 1 |
| 2021-03-06 07:34:12 | 1 |
| 2021-03-06 07:34:43 | 1 |
| 2021-03-06 07:35:14 | 1 |
| 2021-03-06 07:35:44 | 1 |
| 2021-03-06 07:36:15 | 1 |
| 2021-03-06 07:36:46 | 1 |
| 2021-03-06 07:37:16 | 1 |
| 2021-03-06 07:37:47 | 1 |
| 2021-03-06 07:38:18 | 1 |
| 2021-03-06 07:38:49 | 1 |
| 2021-03-06 07:39:19 | 1 |
| 2021-03-06 07:39:50 | 1 |
| 2021-03-06 07:40:21 | 1 |
| 2021-03-06 07:40:51 | 1 |
| 2021-03-06 07:41:22 | 1 |
| 2021-03-06 07:41:53 | 1 |
| 2021-03-06 07:42:23 | 1 |
| 2021-03-06 07:42:54 | 1 |
| 2021-03-06 07:43:25 | 1 |
| 2021-03-06 07:43:55 | 1 |
| 2021-03-06 07:44:26 | 1 |
| 2021-03-06 07:44:57 | 1 |
| 2021-03-06 07:45:27 | 1 |
| 2021-03-06 07:45:58 | 1 |
| 2021-03-06 07:46:29 | 1 |
| 2021-03-06 07:46:59 | 1 |
| 2021-03-06 07:47:30 | 1 |
| 2021-03-06 07:48:01 | 1 |
| 2021-03-06 07:48:32 | 1 |
| 2021-03-06 07:49:02 | 1 |
| 2021-03-06 07:49:33 | 1 |
| 2021-03-06 07:50:04 | 1 |
| 2021-03-06 07:50:34 | 1 |
| 2021-03-06 07:51:05 | 1 |
| 2021-03-06 07:51:36 | 1 |
| 2021-03-06 07:52:06 | 1 |
| 2021-03-06 07:52:37 | 1 |
| 2021-03-06 07:53:08 | 1 |
| 2021-03-06 07:53:38 | 1 |
| 2021-03-06 07:54:09 | 1 |
| 2021-03-06 07:54:40 | 1 |
| 2021-03-06 07:55:10 | 1 |
| 2021-03-06 07:55:41 | 1 |
| 2021-03-06 07:56:12 | 1 |
| 2021-03-06 07:56:42 | 1 |
| 2021-03-06 07:57:13 | 1 |
| 2021-03-06 07:57:44 | 1 |
| 2021-03-06 07:58:15 | 1 |
| 2021-03-06 07:58:45 | 1 |
| 2021-03-06 07:59:16 | 1 |
| 2021-03-06 07:59:47 | 1 |
| 2021-03-06 08:00:17 | 1 |
| 2021-03-06 08:00:48 | 1 |
| 2021-03-06 08:01:19 | 1 |
| 2021-03-06 08:01:49 | 1 |
| 2021-03-06 08:02:20 | 1 |
| 2021-03-06 08:02:51 | 1 |
| 2021-03-06 08:03:21 | 1 |
| 2021-03-06 08:03:52 | 1 |
| 2021-03-06 08:04:23 | 1 |
| 2021-03-06 08:04:53 | 1 |
| 2021-03-06 08:05:24 | 1 |
| 2021-03-06 08:05:55 | 1 |
| 2021-03-06 08:06:25 | 1 |
| 2021-03-06 08:06:56 | 1 |
| 2021-03-06 08:07:27 | 1 |
| 2021-03-06 08:07:57 | 1 |
| 2021-03-06 08:08:28 | 1 |
| 2021-03-06 08:08:59 | 1 |
| 2021-03-06 08:09:30 | 1 |
| 2021-03-06 08:10:00 | 1 |
| 2021-03-06 08:10:31 | 1 |
| 2021-03-06 08:11:02 | 1 |
| 2021-03-06 08:11:32 | 1 |
| 2021-03-06 08:12:03 | 1 |
| 2021-03-06 08:12:34 | 1 |
| 2021-03-06 08:13:04 | 1 |
| 2021-03-06 08:13:35 | 1 |
| 2021-03-06 08:14:06 | 1 |
| 2021-03-06 08:14:36 | 1 |
| 2021-03-06 08:15:07 | 1 |
| 2021-03-06 08:15:38 | 1 |
| 2021-03-06 08:16:08 | 1 |
| 2021-03-06 08:16:39 | 1 |
| 2021-03-06 08:17:10 | 1 |
| 2021-03-06 08:17:40 | 1 |
| 2021-03-06 08:18:11 | 1 |
| 2021-03-06 08:18:42 | 1 |
| 2021-03-06 08:19:12 | 1 |
| 2021-03-06 08:19:43 | 1 |
| 2021-03-06 08:20:14 | 1 |
| 2021-03-06 08:20:45 | 1 |
| 2021-03-06 08:21:15 | 1 |
| 2021-03-06 08:21:46 | 1 |
| 2021-03-06 08:22:17 | 1 |
| 2021-03-06 08:22:47 | 1 |
| 2021-03-06 08:23:18 | 1 |
| 2021-03-06 08:23:49 | 1 |
| 2021-03-06 08:24:19 | 1 |
| 2021-03-06 08:24:50 | 1 |
| 2021-03-06 08:25:21 | 1 |
| 2021-03-06 08:25:51 | 1 |
| 2021-03-06 08:26:22 | 1 |
| 2021-03-06 08:26:53 | 1 |
| 2021-03-06 08:27:23 | 1 |
| 2021-03-06 08:27:54 | 1 |
| 2021-03-06 08:28:25 | 1 |
| 2021-03-06 08:28:55 | 1 |
| 2021-03-06 08:29:26 | 1 |
| 2021-03-06 08:29:57 | 1 |
| 2021-03-06 08:30:28 | 1 |
| 2021-03-06 08:30:58 | 1 |
| 2021-03-06 08:31:29 | 1 |
| 2021-03-06 08:32:00 | 1 |
| 2021-03-06 08:32:30 | 1 |
| 2021-03-06 08:33:01 | 1 |
| 2021-03-06 08:33:32 | 1 |
| 2021-03-06 08:34:02 | 1 |
| 2021-03-06 08:34:33 | 1 |
| 2021-03-06 08:35:04 | 1 |
| 2021-03-06 08:35:34 | 1 |
| 2021-03-06 08:36:05 | 1 |
| 2021-03-06 08:36:36 | 1 |
| 2021-03-06 08:37:06 | 1 |
| 2021-03-06 08:37:37 | 1 |
| 2021-03-06 08:38:08 | 1 |
| 2021-03-06 08:38:39 | 1 |
| 2021-03-06 08:39:09 | 1 |
| 2021-03-06 08:39:40 | 1 |
| 2021-03-06 08:40:11 | 1 |
| 2021-03-06 08:40:41 | 1 |
| 2021-03-06 08:41:12 | 1 |
| 2021-03-06 08:41:43 | 1 |
| 2021-03-06 08:42:13 | 1 |
| 2021-03-06 08:42:44 | 1 |
| 2021-03-06 08:43:15 | 1 |
| 2021-03-06 08:43:45 | 1 |
| 2021-03-06 08:44:16 | 1 |
| 2021-03-06 08:44:47 | 1 |
| 2021-03-06 08:45:17 | 1 |
| 2021-03-06 08:45:48 | 1 |
| 2021-03-06 08:46:19 | 1 |
| 2021-03-06 08:46:49 | 1 |
| 2021-03-06 08:47:20 | 1 |
| 2021-03-06 08:47:51 | 1 |
| 2021-03-06 08:48:22 | 1 |
| 2021-03-06 08:48:52 | 1 |
| 2021-03-06 08:49:23 | 1 |
| 2021-03-06 08:49:54 | 1 |
| 2021-03-06 08:50:24 | 1 |
| 2021-03-06 08:50:55 | 1 |
| 2021-03-06 08:51:26 | 1 |
| 2021-03-06 08:51:56 | 1 |
| 2021-03-06 08:52:27 | 1 |
| 2021-03-06 08:52:58 | 1 |
| 2021-03-06 08:53:28 | 1 |
| 2021-03-06 08:53:59 | 1 |
| 2021-03-06 08:54:30 | 1 |
| 2021-03-06 08:55:00 | 1 |
| 2021-03-06 08:55:31 | 1 |
| 2021-03-06 08:56:02 | 1 |
| 2021-03-06 08:56:33 | 1 |
| 2021-03-06 08:57:03 | 1 |
| 2021-03-06 08:57:34 | 1 |
| 2021-03-06 08:58:05 | 1 |
| 2021-03-06 08:58:35 | 1 |
| 2021-03-06 08:59:06 | 1 |
| 2021-03-06 08:59:37 | 1 |
| 2021-03-06 09:00:07 | 1 |
| 2021-03-06 09:00:38 | 1 |
| 2021-03-06 09:01:09 | 1 |
| 2021-03-06 09:01:39 | 1 |
| 2021-03-06 09:02:10 | 1 |
| 2021-03-06 09:02:41 | 1 |
| 2021-03-06 09:03:11 | 1 |
| 2021-03-06 09:03:42 | 1 |
| 2021-03-06 09:04:13 | 1 |
| 2021-03-06 09:04:44 | 1 |
| 2021-03-06 09:05:14 | 1 |
| 2021-03-06 09:05:45 | 1 |
| 2021-03-06 09:06:16 | 1 |
| 2021-03-06 09:06:46 | 1 |
| 2021-03-06 09:07:17 | 1 |
| 2021-03-06 09:07:48 | 1 |
| 2021-03-06 09:08:18 | 1 |
| 2021-03-06 09:08:49 | 1 |
| 2021-03-06 09:09:20 | 1 |
| 2021-03-06 09:09:50 | 1 |
| 2021-03-06 09:10:21 | 1 |
| 2021-03-06 09:10:52 | 1 |
| 2021-03-06 09:11:22 | 1 |
| 2021-03-06 09:11:53 | 1 |
| 2021-03-06 09:12:24 | 1 |
| 2021-03-06 09:12:54 | 1 |
| 2021-03-06 09:13:25 | 1 |
| 2021-03-06 09:13:56 | 1 |
| 2021-03-06 09:14:27 | 1 |
| 2021-03-06 09:14:57 | 1 |
| 2021-03-06 09:15:28 | 1 |
| 2021-03-06 09:15:59 | 1 |
| 2021-03-06 09:16:29 | 1 |
| 2021-03-06 09:17:00 | 1 |
| 2021-03-06 09:17:31 | 1 |
| 2021-03-06 09:18:01 | 1 |
| 2021-03-06 09:18:32 | 1 |
| 2021-03-06 09:19:03 | 1 |
| 2021-03-06 09:19:33 | 1 |
| 2021-03-06 09:20:04 | 1 |
| 2021-03-06 09:20:35 | 1 |
| 2021-03-06 09:21:05 | 1 |
| 2021-03-06 09:21:36 | 1 |
| 2021-03-06 09:22:07 | 1 |
| 2021-03-06 09:22:37 | 1 |
| 2021-03-06 09:23:08 | 1 |
| 2021-03-06 09:23:39 | 1 |
| 2021-03-06 09:24:10 | 1 |
| 2021-03-06 09:24:40 | 1 |
| 2021-03-06 09:25:11 | 1 |
| 2021-03-06 09:25:42 | 1 |
| 2021-03-06 09:26:12 | 1 |
| 2021-03-06 09:26:43 | 1 |
| 2021-03-06 09:27:14 | 1 |
| 2021-03-06 09:27:44 | 1 |
| 2021-03-06 09:28:15 | 1 |
| 2021-03-06 09:28:46 | 1 |
| 2021-03-06 09:29:16 | 1 |
| 2021-03-06 09:29:47 | 1 |
| 2021-03-06 09:30:18 | 1 |
| 2021-03-06 09:30:48 | 1 |
| 2021-03-06 09:31:19 | 1 |
| 2021-03-06 09:31:50 | 1 |
| 2021-03-06 09:32:20 | 1 |
| 2021-03-06 09:32:51 | 1 |
| 2021-03-06 09:33:22 | 1 |
| 2021-03-06 09:33:53 | 1 |
| 2021-03-06 09:34:23 | 1 |
| 2021-03-06 09:34:54 | 1 |
| 2021-03-06 09:35:25 | 1 |
| 2021-03-06 09:35:55 | 1 |
| 2021-03-06 09:36:26 | 1 |
| 2021-03-06 09:36:57 | 1 |
| 2021-03-06 09:37:27 | 1 |
| 2021-03-06 09:37:58 | 1 |
| 2021-03-06 09:38:29 | 1 |
| 2021-03-06 09:38:59 | 1 |
| 2021-03-06 09:39:30 | 1 |
| 2021-03-06 09:40:01 | 1 |
| 2021-03-06 09:40:31 | 1 |
| 2021-03-06 09:41:02 | 1 |
| 2021-03-06 09:41:33 | 1 |
| 2021-03-06 09:42:03 | 1 |
| 2021-03-06 09:42:34 | 1 |
| 2021-03-06 09:43:05 | 1 |
| 2021-03-06 09:43:36 | 1 |
| 2021-03-06 09:44:06 | 1 |
| 2021-03-06 09:44:37 | 1 |
| 2021-03-06 09:45:08 | 1 |
| 2021-03-06 09:45:38 | 1 |
| 2021-03-06 09:46:09 | 1 |
| 2021-03-06 09:46:40 | 1 |
| 2021-03-06 09:47:10 | 1 |
| 2021-03-06 09:47:41 | 1 |
| 2021-03-06 09:48:12 | 1 |
| 2021-03-06 09:48:42 | 1 |
| 2021-03-06 09:49:13 | 1 |
| 2021-03-06 09:49:44 | 1 |
| 2021-03-06 09:50:14 | 1 |
| 2021-03-06 09:50:45 | 1 |
| 2021-03-06 09:51:16 | 1 |
| 2021-03-06 09:51:46 | 1 |
| 2021-03-06 09:52:17 | 1 |
| 2021-03-06 09:52:48 | 1 |
| 2021-03-06 09:53:19 | 1 |
| 2021-03-06 09:53:49 | 1 |
| 2021-03-06 09:54:20 | 1 |
| 2021-03-06 09:54:51 | 1 |
| 2021-03-06 09:55:21 | 1 |
| 2021-03-06 09:55:52 | 1 |
| 2021-03-06 09:56:23 | 1 |
| 2021-03-06 09:56:53 | 1 |
| 2021-03-06 09:57:24 | 1 |
| 2021-03-06 09:57:55 | 1 |
| 2021-03-06 09:58:25 | 1 |
| 2021-03-06 09:58:56 | 1 |
| 2021-03-06 09:59:27 | 1 |
| 2021-03-06 09:59:57 | 1 |
| 2021-03-06 10:00:28 | 1 |
| 2021-03-06 10:00:59 | 1 |
| 2021-03-06 10:01:29 | 1 |
| 2021-03-06 10:02:00 | 1 |
| 2021-03-06 10:02:31 | 1 |
| 2021-03-06 10:03:02 | 1 |
| 2021-03-06 10:03:32 | 1 |
| 2021-03-06 10:04:03 | 1 |
| 2021-03-06 10:04:34 | 1 |
| 2021-03-06 10:05:04 | 1 |
| 2021-03-06 10:05:35 | 1 |
| 2021-03-06 10:06:06 | 1 |
| 2021-03-06 10:06:36 | 1 |
| 2021-03-06 10:07:07 | 1 |
| 2021-03-06 10:07:38 | 1 |
| 2021-03-06 10:08:08 | 1 |
| 2021-03-06 10:08:39 | 1 |
| 2021-03-06 10:09:10 | 1 |
| 2021-03-06 10:09:40 | 1 |
| 2021-03-06 10:10:11 | 1 |
| 2021-03-06 10:10:42 | 1 |
| 2021-03-06 10:11:12 | 1 |
| 2021-03-06 10:11:43 | 1 |
| 2021-03-06 10:12:14 | 1 |
| 2021-03-06 10:12:45 | 1 |
| 2021-03-06 10:13:15 | 1 |
| 2021-03-06 10:13:46 | 1 |
| 2021-03-06 10:14:17 | 1 |
| 2021-03-06 10:14:47 | 1 |
| 2021-03-06 10:15:18 | 1 |
| 2021-03-06 10:15:49 | 1 |
| 2021-03-06 10:16:19 | 1 |
| 2021-03-06 10:16:50 | 1 |
| 2021-03-06 10:17:21 | 1 |
| 2021-03-06 10:17:51 | 1 |
| 2021-03-06 10:18:22 | 1 |
| 2021-03-06 10:18:53 | 1 |
| 2021-03-06 10:19:23 | 1 |
| 2021-03-06 10:19:54 | 1 |
| 2021-03-06 10:20:25 | 1 |
| 2021-03-06 10:20:55 | 1 |
| 2021-03-06 10:21:26 | 1 |
| 2021-03-06 10:21:57 | 1 |
| 2021-03-06 10:22:27 | 1 |
| 2021-03-06 10:22:58 | 1 |
| 2021-03-06 10:23:29 | 1 |
| 2021-03-06 10:24:00 | 1 |
| 2021-03-06 10:24:30 | 1 |
| 2021-03-06 10:25:01 | 1 |
| 2021-03-06 10:25:32 | 1 |
| 2021-03-06 10:26:02 | 1 |
| 2021-03-06 10:26:33 | 1 |
| 2021-03-06 10:27:04 | 1 |
| 2021-03-06 10:27:34 | 1 |
| 2021-03-06 10:28:05 | 1 |
| 2021-03-06 10:28:36 | 1 |
| 2021-03-06 10:29:06 | 1 |
| 2021-03-06 10:29:37 | 1 |
| 2021-03-06 10:30:08 | 1 |
| 2021-03-06 10:30:38 | 1 |
| 2021-03-06 10:31:09 | 1 |
| 2021-03-06 10:31:40 | 1 |
| 2021-03-06 10:32:10 | 1 |
| 2021-03-06 10:32:41 | 1 |
| 2021-03-06 10:33:12 | 1 |
| 2021-03-06 10:33:43 | 1 |
| 2021-03-06 10:34:13 | 1 |
| 2021-03-06 10:34:44 | 1 |
| 2021-03-06 10:35:15 | 1 |
| 2021-03-06 10:35:45 | 1 |
| 2021-03-06 10:36:16 | 1 |
| 2021-03-06 10:36:47 | 1 |
| 2021-03-06 10:37:17 | 1 |
| 2021-03-06 10:37:48 | 1 |
| 2021-03-06 10:38:19 | 1 |
| 2021-03-06 10:38:49 | 1 |
| 2021-03-06 10:39:20 | 1 |
| 2021-03-06 10:39:51 | 1 |
| 2021-03-06 10:40:21 | 1 |
| 2021-03-06 10:40:52 | 1 |
| 2021-03-06 10:41:23 | 1 |
| 2021-03-06 10:41:53 | 1 |
| 2021-03-06 10:42:24 | 1 |
| 2021-03-06 10:42:55 | 1 |
| 2021-03-06 10:43:25 | 1 |
| 2021-03-06 10:43:56 | 1 |
| 2021-03-06 10:44:27 | 1 |
| 2021-03-06 10:44:58 | 1 |
| 2021-03-06 10:45:28 | 1 |
| 2021-03-06 10:45:59 | 1 |
| 2021-03-06 10:46:30 | 1 |
| 2021-03-06 10:47:00 | 1 |
| 2021-03-06 10:47:31 | 1 |
| 2021-03-06 10:48:02 | 1 |
| 2021-03-06 10:48:32 | 1 |
| 2021-03-06 10:49:03 | 1 |
| 2021-03-06 10:49:34 | 1 |
| 2021-03-06 10:50:04 | 1 |
| 2021-03-06 10:50:35 | 1 |
| 2021-03-06 10:51:06 | 1 |
| 2021-03-06 10:51:36 | 1 |
| 2021-03-06 10:52:07 | 1 |
| 2021-03-06 10:52:38 | 1 |
| 2021-03-06 10:53:09 | 1 |
| 2021-03-06 10:53:39 | 1 |
| 2021-03-06 10:54:10 | 1 |
| 2021-03-06 10:54:41 | 1 |
| 2021-03-06 10:55:11 | 1 |
| 2021-03-06 10:55:42 | 1 |
| 2021-03-06 10:56:13 | 1 |
| 2021-03-06 10:56:43 | 1 |
| 2021-03-06 10:57:14 | 1 |
| 2021-03-06 10:57:45 | 1 |
| 2021-03-06 10:58:15 | 1 |
| 2021-03-06 10:58:46 | 1 |
| 2021-03-06 10:59:17 | 1 |
| 2021-03-06 10:59:47 | 1 |
| 2021-03-06 11:00:18 | 1 |
| 2021-03-06 11:00:49 | 1 |
| 2021-03-06 11:01:20 | 1 |
| 2021-03-06 11:01:50 | 1 |
| 2021-03-06 11:02:21 | 1 |
| 2021-03-06 11:02:52 | 1 |
| 2021-03-06 11:03:22 | 1 |
| 2021-03-06 11:03:53 | 1 |
| 2021-03-06 11:04:24 | 1 |
| 2021-03-06 11:04:54 | 1 |
| 2021-03-06 11:05:25 | 1 |
| 2021-03-06 11:05:56 | 1 |
| 2021-03-06 11:06:26 | 1 |
| 2021-03-06 11:06:57 | 1 |
| 2021-03-06 11:07:28 | 1 |
| 2021-03-06 11:07:58 | 1 |
| 2021-03-06 11:08:29 | 1 |
| 2021-03-06 11:09:00 | 1 |
| 2021-03-06 11:09:30 | 1 |
| 2021-03-06 11:10:01 | 1 |
| 2021-03-06 11:10:32 | 1 |
| 2021-03-06 11:11:03 | 1 |
| 2021-03-06 11:11:33 | 1 |
| 2021-03-06 11:12:04 | 1 |
| 2021-03-06 11:12:35 | 1 |
| 2021-03-06 11:13:05 | 1 |
| 2021-03-06 11:13:36 | 1 |
| 2021-03-06 11:14:07 | 1 |
| 2021-03-06 11:14:37 | 1 |
| 2021-03-06 11:15:08 | 1 |
| 2021-03-06 11:15:39 | 1 |
| 2021-03-06 11:16:09 | 1 |
| 2021-03-06 11:16:40 | 1 |
| 2021-03-06 11:17:11 | 1 |
| 2021-03-06 11:17:41 | 1 |
| 2021-03-06 11:18:12 | 1 |
| 2021-03-06 11:18:43 | 1 |
| 2021-03-06 11:19:14 | 1 |
| 2021-03-06 11:19:44 | 1 |
| 2021-03-06 11:20:15 | 1 |
| 2021-03-06 11:20:46 | 1 |
| 2021-03-06 11:21:16 | 1 |
| 2021-03-06 11:21:47 | 1 |
| 2021-03-06 11:22:18 | 1 |
| 2021-03-06 11:22:48 | 1 |
| 2021-03-06 11:23:19 | 1 |
| 2021-03-06 11:23:50 | 1 |
| 2021-03-06 11:24:20 | 1 |
| 2021-03-06 11:24:51 | 1 |
| 2021-03-06 11:25:22 | 1 |
| 2021-03-06 11:25:52 | 1 |
| 2021-03-06 11:26:23 | 1 |
| 2021-03-06 11:26:54 | 1 |
| 2021-03-06 11:27:24 | 1 |
| 2021-03-06 11:27:55 | 1 |
| 2021-03-06 11:28:26 | 1 |
| 2021-03-06 11:28:57 | 1 |
| 2021-03-06 11:29:27 | 1 |
| 2021-03-06 11:29:58 | 1 |
| 2021-03-06 11:30:29 | 1 |
| 2021-03-06 11:30:59 | 1 |
| 2021-03-06 11:31:30 | 1 |
| 2021-03-06 11:32:01 | 1 |
| 2021-03-06 11:32:31 | 1 |
| 2021-03-06 11:33:02 | 1 |
| 2021-03-06 11:33:33 | 1 |
| 2021-03-06 11:34:03 | 1 |
| 2021-03-06 11:34:34 | 1 |
| 2021-03-06 11:35:05 | 1 |
| 2021-03-06 11:35:35 | 1 |
| 2021-03-06 11:36:06 | 1 |
| 2021-03-06 11:36:37 | 1 |
| 2021-03-06 11:37:07 | 1 |
| 2021-03-06 11:37:38 | 1 |
| 2021-03-06 11:38:09 | 1 |
| 2021-03-06 11:38:40 | 1 |
| 2021-03-06 11:39:10 | 1 |
| 2021-03-06 11:39:41 | 1 |
| 2021-03-06 11:40:12 | 1 |
| 2021-03-06 11:40:42 | 1 |
| 2021-03-06 11:41:13 | 1 |
| 2021-03-06 11:41:44 | 1 |
| 2021-03-06 11:42:14 | 1 |
| 2021-03-06 11:42:45 | 1 |
| 2021-03-06 11:43:16 | 1 |
| 2021-03-06 11:43:46 | 1 |
| 2021-03-06 11:44:17 | 1 |
| 2021-03-06 11:44:48 | 1 |
| 2021-03-06 11:45:18 | 1 |
| 2021-03-06 11:45:49 | 1 |
| 2021-03-06 11:46:20 | 1 |
| 2021-03-06 11:46:50 | 1 |
| 2021-03-06 11:47:21 | 1 |
| 2021-03-06 11:47:52 | 1 |
| 2021-03-06 11:48:22 | 1 |
| 2021-03-06 11:48:53 | 1 |
| 2021-03-06 11:49:24 | 1 |
| 2021-03-06 11:49:55 | 1 |
| 2021-03-06 11:50:25 | 1 |
| 2021-03-06 11:50:56 | 1 |
| 2021-03-06 11:51:27 | 1 |
| 2021-03-06 11:51:57 | 1 |
| 2021-03-06 11:52:28 | 1 |
| 2021-03-06 11:52:59 | 1 |
| 2021-03-06 11:53:29 | 1 |
| 2021-03-06 11:54:00 | 1 |
| 2021-03-06 11:54:31 | 1 |
| 2021-03-06 11:55:01 | 1 |
| 2021-03-06 11:55:32 | 1 |
| 2021-03-06 11:56:03 | 1 |
| 2021-03-06 11:56:33 | 1 |
| 2021-03-06 11:57:04 | 1 |
| 2021-03-06 11:57:35 | 1 |
| 2021-03-06 11:58:05 | 1 |
| 2021-03-06 11:58:36 | 1 |
| 2021-03-06 11:59:07 | 1 |
| 2021-03-06 11:59:38 | 1 |
| 2021-03-06 12:00:08 | 1 |
| 2021-03-06 12:00:39 | 1 |
| 2021-03-06 12:01:10 | 1 |
| 2021-03-06 12:01:40 | 1 |
| 2021-03-06 12:02:11 | 1 |
| 2021-03-06 12:02:42 | 1 |
| 2021-03-06 12:03:12 | 1 |
| 2021-03-06 12:03:43 | 1 |
| 2021-03-06 12:04:14 | 1 |
| 2021-03-06 12:04:44 | 1 |
| 2021-03-06 12:05:15 | 1 |
| 2021-03-06 12:05:46 | 1 |
| 2021-03-06 12:06:16 | 1 |
| 2021-03-06 12:06:47 | 1 |
| 2021-03-06 12:07:18 | 1 |
| 2021-03-06 12:07:48 | 1 |
| 2021-03-06 12:08:19 | 1 |
| 2021-03-06 12:08:50 | 1 |
| 2021-03-06 12:09:21 | 1 |
| 2021-03-06 12:09:51 | 1 |
| 2021-03-06 12:10:22 | 1 |
| 2021-03-06 12:10:53 | 1 |
| 2021-03-06 12:11:23 | 1 |
| 2021-03-06 12:11:54 | 1 |
| 2021-03-06 12:12:25 | 1 |
| 2021-03-06 12:12:55 | 1 |
| 2021-03-06 12:13:26 | 1 |
| 2021-03-06 12:13:57 | 1 |
| 2021-03-06 12:14:27 | 1 |
| 2021-03-06 12:14:58 | 1 |
| 2021-03-06 12:15:29 | 1 |
| 2021-03-06 12:15:59 | 1 |
| 2021-03-06 12:16:30 | 1 |
| 2021-03-06 12:17:01 | 1 |
| 2021-03-06 12:17:31 | 1 |
| 2021-03-06 12:18:02 | 1 |
| 2021-03-06 12:18:33 | 1 |
| 2021-03-06 12:19:03 | 1 |
| 2021-03-06 12:19:34 | 1 |
| 2021-03-06 12:20:05 | 1 |
| 2021-03-06 12:20:36 | 1 |
| 2021-03-06 12:21:06 | 1 |
| 2021-03-06 12:21:37 | 1 |
| 2021-03-06 12:22:08 | 1 |
| 2021-03-06 12:22:38 | 1 |
| 2021-03-06 12:23:09 | 1 |
| 2021-03-06 12:23:40 | 1 |
| 2021-03-06 12:24:10 | 1 |
| 2021-03-06 12:24:41 | 1 |
| 2021-03-06 12:25:12 | 1 |
| 2021-03-06 12:25:42 | 1 |
| 2021-03-06 12:26:13 | 1 |
| 2021-03-06 12:26:44 | 1 |
| 2021-03-06 12:27:14 | 1 |
| 2021-03-06 12:27:45 | 1 |
| 2021-03-06 12:28:16 | 1 |
| 2021-03-06 12:28:46 | 1 |
| 2021-03-06 12:29:17 | 1 |
| 2021-03-06 12:29:48 | 1 |
| 2021-03-06 12:30:19 | 1 |
| 2021-03-06 12:30:49 | 1 |
| 2021-03-06 12:31:20 | 1 |
| 2021-03-06 12:31:51 | 1 |
| 2021-03-06 12:32:21 | 1 |
| 2021-03-06 12:32:52 | 1 |
| 2021-03-06 12:33:23 | 1 |
| 2021-03-06 12:33:53 | 1 |
| 2021-03-06 12:34:24 | 1 |
| 2021-03-06 12:34:55 | 1 |
| 2021-03-06 12:35:25 | 1 |
| 2021-03-06 12:35:56 | 1 |
| 2021-03-06 12:36:27 | 1 |
| 2021-03-06 12:36:57 | 1 |
| 2021-03-06 12:37:28 | 1 |
| 2021-03-06 12:37:59 | 1 |
| 2021-03-06 12:38:29 | 1 |
| 2021-03-06 12:39:00 | 1 |
| 2021-03-06 12:39:31 | 1 |
| 2021-03-06 12:40:01 | 1 |
| 2021-03-06 12:40:32 | 1 |
| 2021-03-06 12:41:03 | 1 |
| 2021-03-06 12:41:34 | 1 |
| 2021-03-06 12:42:04 | 1 |
| 2021-03-06 12:42:35 | 1 |
| 2021-03-06 12:43:06 | 1 |
| 2021-03-06 12:43:36 | 1 |
| 2021-03-06 12:44:07 | 1 |
| 2021-03-06 12:44:38 | 1 |
| 2021-03-06 12:45:08 | 1 |
| 2021-03-06 12:45:39 | 1 |
| 2021-03-06 12:46:10 | 1 |
| 2021-03-06 12:46:40 | 1 |
| 2021-03-06 12:47:11 | 1 |
| 2021-03-06 12:47:42 | 1 |
| 2021-03-06 12:48:12 | 1 |
| 2021-03-06 12:48:43 | 1 |
| 2021-03-06 12:49:14 | 1 |
| 2021-03-06 12:49:44 | 1 |
| 2021-03-06 12:50:15 | 1 |
| 2021-03-06 12:50:46 | 1 |
| 2021-03-06 12:51:17 | 1 |
| 2021-03-06 12:51:47 | 1 |
| 2021-03-06 12:52:18 | 1 |
| 2021-03-06 12:52:49 | 1 |
| 2021-03-06 12:53:19 | 1 |
| 2021-03-06 12:53:50 | 1 |
| 2021-03-06 12:54:21 | 1 |
| 2021-03-06 12:54:51 | 1 |
| 2021-03-06 12:55:22 | 1 |
| 2021-03-06 12:55:53 | 1 |
| 2021-03-06 12:56:23 | 1 |
| 2021-03-06 12:56:54 | 1 |
| 2021-03-06 12:57:25 | 1 |
| 2021-03-06 12:57:55 | 1 |
| 2021-03-06 12:58:26 | 1 |
| 2021-03-06 12:58:57 | 1 |
| 2021-03-06 12:59:27 | 1 |
| 2021-03-06 12:59:58 | 1 |
| 2021-03-06 13:00:29 | 1 |
| 2021-03-06 13:01:00 | 1 |
| 2021-03-06 13:01:30 | 1 |
| 2021-03-06 13:02:01 | 1 |
| 2021-03-06 13:02:32 | 1 |
| 2021-03-06 13:03:02 | 1 |
| 2021-03-06 13:03:33 | 1 |
| 2021-03-06 13:04:04 | 1 |
| 2021-03-06 13:04:34 | 1 |
| 2021-03-06 13:05:05 | 1 |
| 2021-03-06 13:05:36 | 1 |
| 2021-03-06 13:06:06 | 1 |
| 2021-03-06 13:06:37 | 1 |
| 2021-03-06 13:07:08 | 1 |
| 2021-03-06 13:07:38 | 1 |
| 2021-03-06 13:08:09 | 1 |
| 2021-03-06 13:08:40 | 1 |
| 2021-03-06 13:09:10 | 1 |
| 2021-03-06 13:09:41 | 1 |
| 2021-03-06 13:10:12 | 1 |
| 2021-03-06 13:10:43 | 1 |
| 2021-03-06 13:11:13 | 1 |
| 2021-03-06 13:11:44 | 1 |
| 2021-03-06 13:12:15 | 1 |
| 2021-03-06 13:12:45 | 1 |
| 2021-03-06 13:13:16 | 1 |
| 2021-03-06 13:13:47 | 1 |
| 2021-03-06 13:14:17 | 1 |
| 2021-03-06 13:14:48 | 1 |
| 2021-03-06 13:15:19 | 1 |
| 2021-03-06 13:15:49 | 1 |
| 2021-03-06 13:16:20 | 1 |
| 2021-03-06 13:16:51 | 1 |
| 2021-03-06 13:17:21 | 1 |
| 2021-03-06 13:17:52 | 1 |
| 2021-03-06 13:18:23 | 1 |
| 2021-03-06 13:18:53 | 1 |
| 2021-03-06 13:19:24 | 1 |
| 2021-03-06 13:19:55 | 1 |
| 2021-03-06 13:20:25 | 1 |
| 2021-03-06 13:20:56 | 1 |
| 2021-03-06 13:21:27 | 1 |
| 2021-03-06 13:21:58 | 1 |
| 2021-03-06 13:22:28 | 1 |
| 2021-03-06 13:22:59 | 1 |
| 2021-03-06 13:23:30 | 1 |
| 2021-03-06 13:24:00 | 1 |
| 2021-03-06 13:24:31 | 1 |
| 2021-03-06 13:25:02 | 1 |
| 2021-03-06 13:25:32 | 1 |
| 2021-03-06 13:26:03 | 1 |
| 2021-03-06 13:26:34 | 1 |
| 2021-03-06 13:27:04 | 1 |
| 2021-03-06 13:27:35 | 1 |
| 2021-03-06 13:28:06 | 1 |
| 2021-03-06 13:28:36 | 1 |
| 2021-03-06 13:29:07 | 1 |
| 2021-03-06 13:29:38 | 1 |
| 2021-03-06 13:30:08 | 1 |
| 2021-03-06 13:30:39 | 1 |
| 2021-03-06 13:31:10 | 1 |
| 2021-03-06 13:31:41 | 1 |
| 2021-03-06 13:32:11 | 1 |
| 2021-03-06 13:32:42 | 1 |
| 2021-03-06 13:33:13 | 1 |
| 2021-03-06 13:33:43 | 1 |
| 2021-03-06 13:34:14 | 1 |
| 2021-03-06 13:34:45 | 1 |
| 2021-03-06 13:35:15 | 1 |
| 2021-03-06 13:35:46 | 1 |
| 2021-03-06 13:36:17 | 1 |
| 2021-03-06 13:36:47 | 1 |
| 2021-03-06 13:37:18 | 1 |
| 2021-03-06 13:37:49 | 1 |
| 2021-03-06 13:38:19 | 1 |
| 2021-03-06 13:38:50 | 1 |
| 2021-03-06 13:39:21 | 1 |
| 2021-03-06 13:39:51 | 1 |
| 2021-03-06 13:40:22 | 1 |
| 2021-03-06 13:40:53 | 1 |
| 2021-03-06 13:41:24 | 1 |
| 2021-03-06 13:41:54 | 1 |
| 2021-03-06 13:42:25 | 1 |
| 2021-03-06 13:42:56 | 1 |
| 2021-03-06 13:43:26 | 1 |
| 2021-03-06 13:43:57 | 1 |
| 2021-03-06 13:44:28 | 1 |
| 2021-03-06 13:44:58 | 1 |
| 2021-03-06 13:45:29 | 1 |
| 2021-03-06 13:46:00 | 1 |
| 2021-03-06 13:46:30 | 1 |
| 2021-03-06 13:47:01 | 1 |
| 2021-03-06 13:47:32 | 1 |
| 2021-03-06 13:48:02 | 1 |
| 2021-03-06 13:48:33 | 1 |
| 2021-03-06 13:49:04 | 1 |
| 2021-03-06 13:49:34 | 1 |
| 2021-03-06 13:50:05 | 1 |
| 2021-03-06 13:50:36 | 1 |
| 2021-03-06 13:51:06 | 1 |
| 2021-03-06 13:51:37 | 1 |
| 2021-03-06 13:52:08 | 1 |
| 2021-03-06 13:52:39 | 1 |
| 2021-03-06 13:53:09 | 1 |
| 2021-03-06 13:53:40 | 1 |
| 2021-03-06 13:54:11 | 1 |
| 2021-03-06 13:54:41 | 1 |
| 2021-03-06 13:55:12 | 1 |
| 2021-03-06 13:55:43 | 1 |
| 2021-03-06 13:56:13 | 1 |
| 2021-03-06 13:56:44 | 1 |
| 2021-03-06 13:57:15 | 1 |
| 2021-03-06 13:57:45 | 1 |
| 2021-03-06 13:58:16 | 1 |
| 2021-03-06 13:58:47 | 1 |
| 2021-03-06 13:59:17 | 1 |
| 2021-03-06 13:59:48 | 1 |
| 2021-03-06 14:00:19 | 1 |
| 2021-03-06 14:00:49 | 1 |
| 2021-03-06 14:01:20 | 1 |
| 2021-03-06 14:01:51 | 1 |
| 2021-03-06 14:02:22 | 1 |
| 2021-03-06 14:02:52 | 1 |
| 2021-03-06 14:03:23 | 1 |
| 2021-03-06 14:03:54 | 1 |
| 2021-03-06 14:04:24 | 1 |
| 2021-03-06 14:04:55 | 1 |
| 2021-03-06 14:05:26 | 1 |
| 2021-03-06 14:05:56 | 1 |
| 2021-03-06 14:06:27 | 1 |
| 2021-03-06 14:06:58 | 1 |
| 2021-03-06 14:07:28 | 1 |
| 2021-03-06 14:07:59 | 1 |
| 2021-03-06 14:08:30 | 1 |
| 2021-03-06 14:09:00 | 1 |
| 2021-03-06 14:09:31 | 1 |
| 2021-03-06 14:10:02 | 1 |
| 2021-03-06 14:10:32 | 1 |
| 2021-03-06 14:11:03 | 1 |
| 2021-03-06 14:11:34 | 1 |
| 2021-03-06 14:12:04 | 1 |
| 2021-03-06 14:12:35 | 1 |
| 2021-03-06 14:13:06 | 1 |
| 2021-03-06 14:13:37 | 1 |
| 2021-03-06 14:14:07 | 1 |
| 2021-03-06 14:14:38 | 1 |
| 2021-03-06 14:15:09 | 1 |
| 2021-03-06 14:15:39 | 1 |
| 2021-03-06 14:16:10 | 1 |
| 2021-03-06 14:16:41 | 1 |
| 2021-03-06 14:17:11 | 1 |
| 2021-03-06 14:17:42 | 1 |
| 2021-03-06 14:18:13 | 1 |
| 2021-03-06 14:18:43 | 1 |
| 2021-03-06 14:19:14 | 1 |
| 2021-03-06 14:19:45 | 1 |
| 2021-03-06 14:20:15 | 1 |
| 2021-03-06 14:20:46 | 1 |
| 2021-03-06 14:21:17 | 1 |
| 2021-03-06 14:21:47 | 1 |
| 2021-03-06 14:22:18 | 1 |
| 2021-03-06 14:22:49 | 1 |
| 2021-03-06 14:23:19 | 1 |
| 2021-03-06 14:23:50 | 1 |
| 2021-03-06 14:24:21 | 1 |
| 2021-03-06 14:24:52 | 1 |
| 2021-03-06 14:25:22 | 1 |
| 2021-03-06 14:25:53 | 1 |
| 2021-03-06 14:26:24 | 1 |
| 2021-03-06 14:26:54 | 1 |
| 2021-03-06 14:27:25 | 1 |
| 2021-03-06 14:27:56 | 1 |
| 2021-03-06 14:28:26 | 1 |
| 2021-03-06 14:28:57 | 1 |
| 2021-03-06 14:29:28 | 1 |
| 2021-03-06 14:29:58 | 1 |
| 2021-03-06 14:30:29 | 1 |
| 2021-03-06 14:31:00 | 1 |
| 2021-03-06 14:31:30 | 1 |
| 2021-03-06 14:32:01 | 1 |
| 2021-03-06 14:32:32 | 1 |
| 2021-03-06 14:33:02 | 1 |
| 2021-03-06 14:33:33 | 1 |
| 2021-03-06 14:34:04 | 1 |
| 2021-03-06 14:34:35 | 1 |
| 2021-03-06 14:35:05 | 1 |
| 2021-03-06 14:35:36 | 1 |
| 2021-03-06 14:36:07 | 1 |
| 2021-03-06 14:36:37 | 1 |
| 2021-03-06 14:37:08 | 1 |
| 2021-03-06 14:37:39 | 1 |
| 2021-03-06 14:38:09 | 1 |
| 2021-03-06 14:38:40 | 1 |
| 2021-03-06 14:39:11 | 1 |
| 2021-03-06 14:39:41 | 1 |
| 2021-03-06 14:40:12 | 1 |
| 2021-03-06 14:40:43 | 1 |
| 2021-03-06 14:41:13 | 1 |
| 2021-03-06 14:41:44 | 1 |
| 2021-03-06 14:42:15 | 1 |
| 2021-03-06 14:42:45 | 1 |
| 2021-03-06 14:43:16 | 1 |
| 2021-03-06 14:43:47 | 1 |
| 2021-03-06 14:44:17 | 1 |
| 2021-03-06 14:44:48 | 1 |
| 2021-03-06 14:45:19 | 1 |
| 2021-03-06 14:45:50 | 1 |
| 2021-03-06 14:46:20 | 1 |
| 2021-03-06 14:46:51 | 1 |
| 2021-03-06 14:47:22 | 1 |
| 2021-03-06 14:47:52 | 1 |
| 2021-03-06 14:48:23 | 1 |
| 2021-03-06 14:48:54 | 1 |
| 2021-03-06 14:49:24 | 1 |
| 2021-03-06 14:49:55 | 1 |
| 2021-03-06 14:50:26 | 1 |
| 2021-03-06 14:50:56 | 1 |
| 2021-03-06 14:51:27 | 1 |
| 2021-03-06 14:51:58 | 1 |
| 2021-03-06 14:52:28 | 1 |
| 2021-03-06 14:52:59 | 1 |
| 2021-03-06 14:53:30 | 1 |
| 2021-03-06 14:54:00 | 1 |
| 2021-03-06 14:54:31 | 1 |
| 2021-03-06 14:55:02 | 1 |
| 2021-03-06 14:55:33 | 1 |
| 2021-03-06 14:56:03 | 1 |
| 2021-03-06 14:56:34 | 1 |
| 2021-03-06 14:57:05 | 1 |
| 2021-03-06 14:57:35 | 1 |
| 2021-03-06 14:58:06 | 1 |
| 2021-03-06 14:58:37 | 1 |
| 2021-03-06 14:59:07 | 1 |
| 2021-03-06 14:59:38 | 1 |
| 2021-03-06 15:00:09 | 1 |
| 2021-03-06 15:00:39 | 1 |
| 2021-03-06 15:01:10 | 1 |
| 2021-03-06 15:01:41 | 1 |
| 2021-03-06 15:02:11 | 1 |
| 2021-03-06 15:02:42 | 1 |
| 2021-03-06 15:03:13 | 1 |
| 2021-03-06 15:03:43 | 1 |
| 2021-03-06 15:04:14 | 1 |
| 2021-03-06 15:04:45 | 1 |
| 2021-03-06 15:05:15 | 1 |
| 2021-03-06 15:05:46 | 1 |
| 2021-03-06 15:06:17 | 1 |
| 2021-03-06 15:06:48 | 1 |
| 2021-03-06 15:07:18 | 1 |
| 2021-03-06 15:07:49 | 1 |
| 2021-03-06 15:08:20 | 1 |
| 2021-03-06 15:08:50 | 1 |
| 2021-03-06 15:09:21 | 1 |
| 2021-03-06 15:09:52 | 1 |
| 2021-03-06 15:10:22 | 1 |
| 2021-03-06 15:10:53 | 1 |
| 2021-03-06 15:11:24 | 1 |
| 2021-03-06 15:11:54 | 1 |
| 2021-03-06 15:12:25 | 1 |
| 2021-03-06 15:12:56 | 1 |
| 2021-03-06 15:13:26 | 1 |
| 2021-03-06 15:13:57 | 1 |
| 2021-03-06 15:14:28 | 1 |
| 2021-03-06 15:14:58 | 1 |
| 2021-03-06 15:15:29 | 1 |
| 2021-03-06 15:16:00 | 1 |
| 2021-03-06 15:16:30 | 1 |
| 2021-03-06 15:17:01 | 1 |
| 2021-03-06 15:17:32 | 1 |
| 2021-03-06 15:18:03 | 1 |
| 2021-03-06 15:18:33 | 1 |
| 2021-03-06 15:19:04 | 1 |
| 2021-03-06 15:19:35 | 1 |
| 2021-03-06 15:20:05 | 1 |
| 2021-03-06 15:20:36 | 1 |
| 2021-03-06 15:21:07 | 1 |
| 2021-03-06 15:21:37 | 1 |
| 2021-03-06 15:22:08 | 1 |
| 2021-03-06 15:22:39 | 1 |
| 2021-03-06 15:23:09 | 1 |
| 2021-03-06 15:23:40 | 1 |
| 2021-03-06 15:24:11 | 1 |
| 2021-03-06 15:24:41 | 1 |
| 2021-03-06 15:25:12 | 1 |
| 2021-03-06 15:25:43 | 1 |
| 2021-03-06 15:26:13 | 1 |
| 2021-03-06 15:26:44 | 1 |
| 2021-03-06 15:27:15 | 1 |
| 2021-03-06 15:27:45 | 1 |
| 2021-03-06 15:28:16 | 1 |
| 2021-03-06 15:28:47 | 1 |